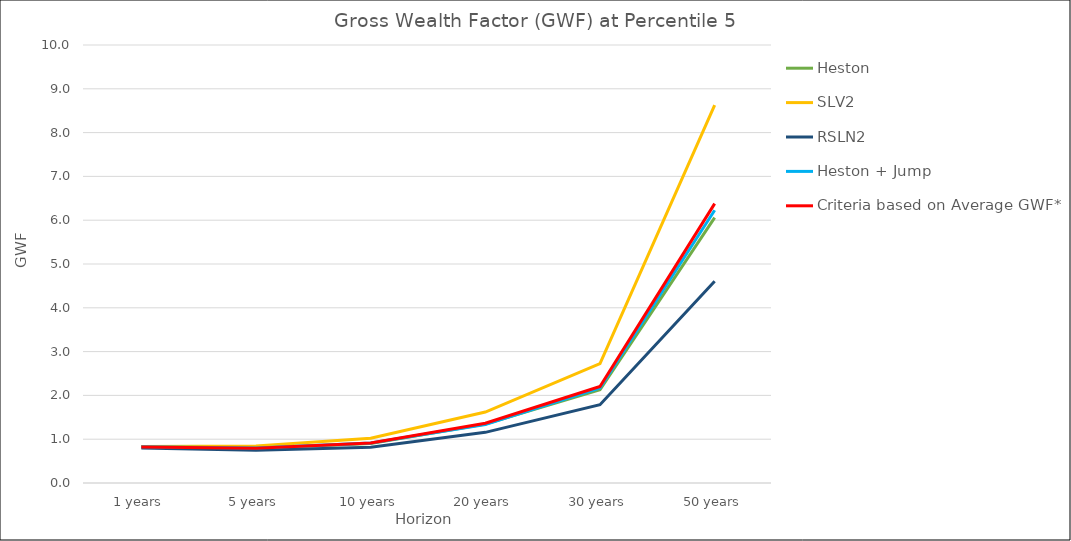
| Category | Heston | SLV2 | RSLN2 | Heston + Jump | Criteria based on Average GWF* |
|---|---|---|---|---|---|
| 1.0 | 0.828 | 0.832 | 0.801 | 0.827 | 0.822 |
| 5.0 | 0.793 | 0.842 | 0.75 | 0.797 | 0.796 |
| 10.0 | 0.904 | 1.022 | 0.819 | 0.914 | 0.915 |
| 20.0 | 1.344 | 1.619 | 1.156 | 1.335 | 1.364 |
| 30.0 | 2.13 | 2.728 | 1.788 | 2.17 | 2.204 |
| 50.0 | 6.058 | 8.626 | 4.605 | 6.228 | 6.379 |